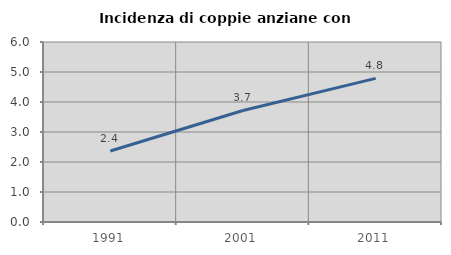
| Category | Incidenza di coppie anziane con figli |
|---|---|
| 1991.0 | 2.366 |
| 2001.0 | 3.718 |
| 2011.0 | 4.787 |